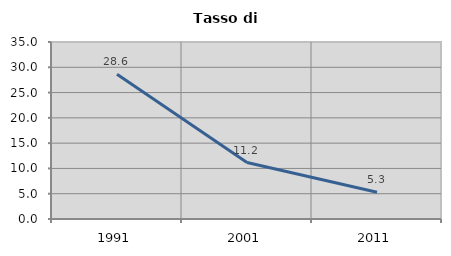
| Category | Tasso di disoccupazione   |
|---|---|
| 1991.0 | 28.63 |
| 2001.0 | 11.164 |
| 2011.0 | 5.305 |